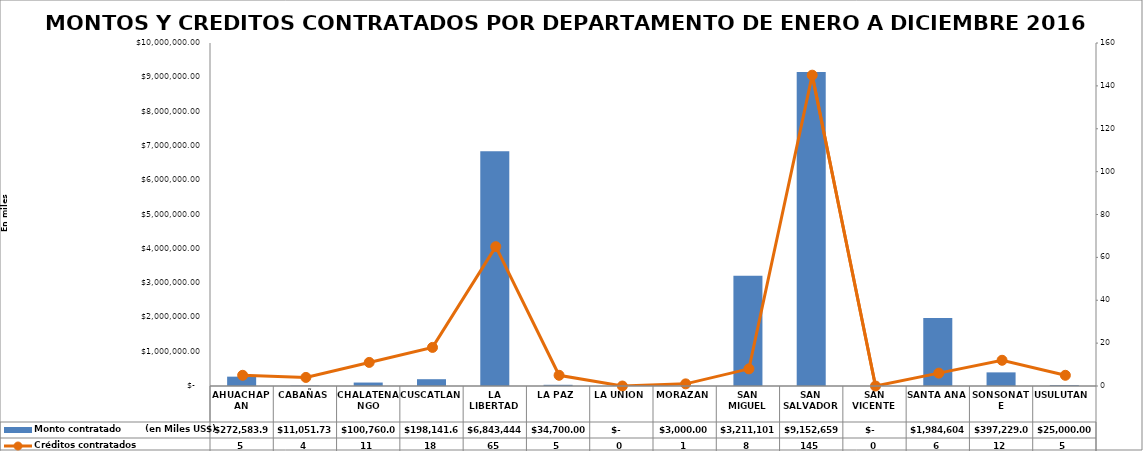
| Category | Monto contratado        (en Miles US$) |
|---|---|
| AHUACHAPAN | 272583.92 |
| CABAÑAS | 11051.73 |
| CHALATENANGO | 100760 |
| CUSCATLAN | 198141.63 |
| LA LIBERTAD | 6843444.36 |
| LA PAZ | 34700 |
| LA UNION | 0 |
| MORAZAN | 3000 |
| SAN MIGUEL | 3211101.21 |
| SAN SALVADOR | 9152659.03 |
| SAN VICENTE | 0 |
| SANTA ANA | 1984604 |
| SONSONATE | 397229 |
| USULUTAN | 25000 |